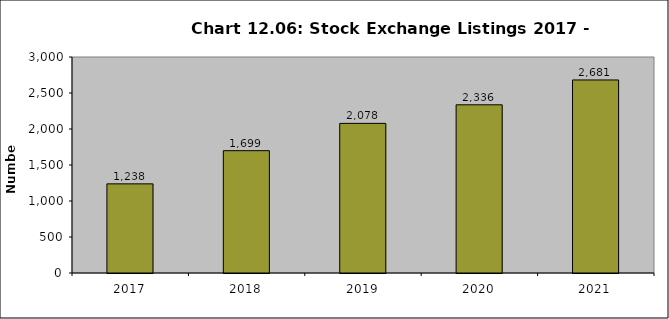
| Category | Series 0 |
|---|---|
| 2017.0 | 1238 |
| 2018.0 | 1699 |
| 2019.0 | 2078 |
| 2020.0 | 2336 |
| 2021.0 | 2681 |